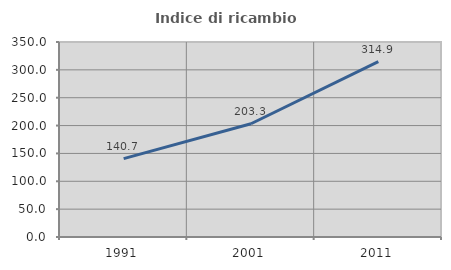
| Category | Indice di ricambio occupazionale  |
|---|---|
| 1991.0 | 140.668 |
| 2001.0 | 203.251 |
| 2011.0 | 314.878 |